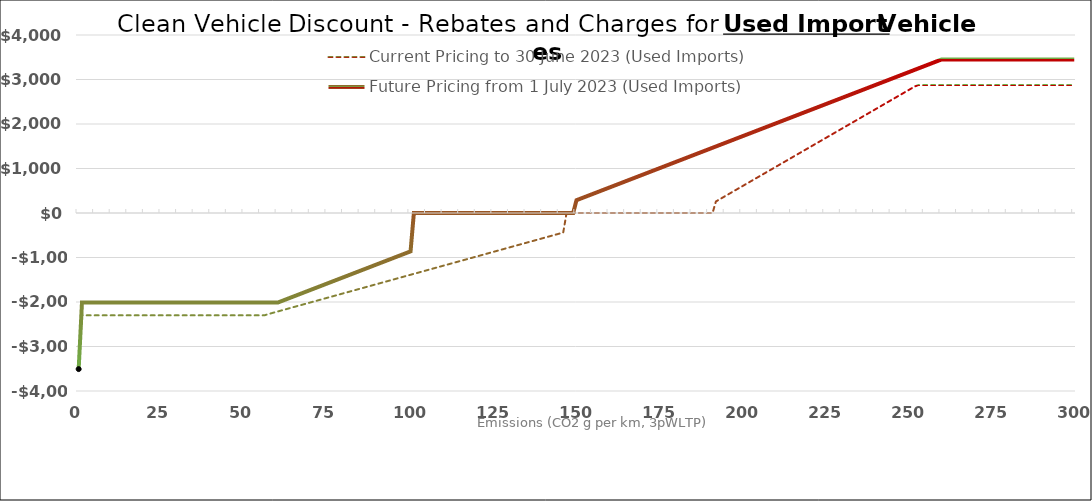
| Category |  Current Pricing to 30 June 2023 (Used Imports)  |  Future Pricing from 1 July 2023 (Used Imports)  |
|---|---|---|
| 0.0 | -3450 | -3507.5 |
| 1.0 | -2300 | -2012.5 |
| 2.0 | -2300 | -2012.5 |
| 3.0 | -2300 | -2012.5 |
| 4.0 | -2300 | -2012.5 |
| 5.0 | -2300 | -2012.5 |
| 6.0 | -2300 | -2012.5 |
| 7.0 | -2300 | -2012.5 |
| 8.0 | -2300 | -2012.5 |
| 9.0 | -2300 | -2012.5 |
| 10.0 | -2300 | -2012.5 |
| 11.0 | -2300 | -2012.5 |
| 12.0 | -2300 | -2012.5 |
| 13.0 | -2300 | -2012.5 |
| 14.0 | -2300 | -2012.5 |
| 15.0 | -2300 | -2012.5 |
| 16.0 | -2300 | -2012.5 |
| 17.0 | -2300 | -2012.5 |
| 18.0 | -2300 | -2012.5 |
| 19.0 | -2300 | -2012.5 |
| 20.0 | -2300 | -2012.5 |
| 21.0 | -2300 | -2012.5 |
| 22.0 | -2300 | -2012.5 |
| 23.0 | -2300 | -2012.5 |
| 24.0 | -2300 | -2012.5 |
| 25.0 | -2300 | -2012.5 |
| 26.0 | -2300 | -2012.5 |
| 27.0 | -2300 | -2012.5 |
| 28.0 | -2300 | -2012.5 |
| 29.0 | -2300 | -2012.5 |
| 30.0 | -2300 | -2012.5 |
| 31.0 | -2300 | -2012.5 |
| 32.0 | -2300 | -2012.5 |
| 33.0 | -2300 | -2012.5 |
| 34.0 | -2300 | -2012.5 |
| 35.0 | -2300 | -2012.5 |
| 36.0 | -2300 | -2012.5 |
| 37.0 | -2300 | -2012.5 |
| 38.0 | -2300 | -2012.5 |
| 39.0 | -2300 | -2012.5 |
| 40.0 | -2300 | -2012.5 |
| 41.0 | -2300 | -2012.5 |
| 42.0 | -2300 | -2012.5 |
| 43.0 | -2300 | -2012.5 |
| 44.0 | -2300 | -2012.5 |
| 45.0 | -2300 | -2012.5 |
| 46.0 | -2300 | -2012.5 |
| 47.0 | -2300 | -2012.5 |
| 48.0 | -2300 | -2012.5 |
| 49.0 | -2300 | -2012.5 |
| 50.0 | -2300 | -2012.5 |
| 51.0 | -2300 | -2012.5 |
| 52.0 | -2300 | -2012.5 |
| 53.0 | -2300 | -2012.5 |
| 54.0 | -2300 | -2012.5 |
| 55.0 | -2300 | -2012.5 |
| 56.0 | -2300 | -2012.5 |
| 57.0 | -2274.621 | -2012.5 |
| 58.0 | -2254 | -2012.5 |
| 59.0 | -2233.379 | -2012.5 |
| 60.0 | -2212.759 | -2012.5 |
| 61.0 | -2192.138 | -1983.75 |
| 62.0 | -2171.517 | -1955 |
| 63.0 | -2150.897 | -1926.25 |
| 64.0 | -2130.276 | -1897.5 |
| 65.0 | -2109.655 | -1868.75 |
| 66.0 | -2089.034 | -1840 |
| 67.0 | -2068.414 | -1811.25 |
| 68.0 | -2047.793 | -1782.5 |
| 69.0 | -2027.172 | -1753.75 |
| 70.0 | -2006.552 | -1725 |
| 71.0 | -1985.931 | -1696.25 |
| 72.0 | -1965.31 | -1667.5 |
| 73.0 | -1944.69 | -1638.75 |
| 74.0 | -1924.069 | -1610 |
| 75.0 | -1903.448 | -1581.25 |
| 76.0 | -1882.828 | -1552.5 |
| 77.0 | -1862.207 | -1523.75 |
| 78.0 | -1841.586 | -1495 |
| 79.0 | -1820.966 | -1466.25 |
| 80.0 | -1800.345 | -1437.5 |
| 81.0 | -1779.724 | -1408.75 |
| 82.0 | -1759.103 | -1380 |
| 83.0 | -1738.483 | -1351.25 |
| 84.0 | -1717.862 | -1322.5 |
| 85.0 | -1697.241 | -1293.75 |
| 86.0 | -1676.621 | -1265 |
| 87.0 | -1656 | -1236.25 |
| 88.0 | -1635.379 | -1207.5 |
| 89.0 | -1614.759 | -1178.75 |
| 90.0 | -1594.138 | -1150 |
| 91.0 | -1573.517 | -1121.25 |
| 92.0 | -1552.897 | -1092.5 |
| 93.0 | -1532.276 | -1063.75 |
| 94.0 | -1511.655 | -1035 |
| 95.0 | -1491.034 | -1006.25 |
| 96.0 | -1470.414 | -977.5 |
| 97.0 | -1449.793 | -948.75 |
| 98.0 | -1429.172 | -920 |
| 99.0 | -1408.552 | -891.25 |
| 100.0 | -1387.931 | -862.5 |
| 101.0 | -1367.31 | 0 |
| 102.0 | -1346.69 | 0 |
| 103.0 | -1326.069 | 0 |
| 104.0 | -1305.448 | 0 |
| 105.0 | -1284.828 | 0 |
| 106.0 | -1264.207 | 0 |
| 107.0 | -1243.586 | 0 |
| 108.0 | -1222.966 | 0 |
| 109.0 | -1202.345 | 0 |
| 110.0 | -1181.724 | 0 |
| 111.0 | -1161.103 | 0 |
| 112.0 | -1140.483 | 0 |
| 113.0 | -1119.862 | 0 |
| 114.0 | -1099.241 | 0 |
| 115.0 | -1078.621 | 0 |
| 116.0 | -1058 | 0 |
| 117.0 | -1037.379 | 0 |
| 118.0 | -1016.759 | 0 |
| 119.0 | -996.138 | 0 |
| 120.0 | -975.517 | 0 |
| 121.0 | -954.897 | 0 |
| 122.0 | -934.276 | 0 |
| 123.0 | -913.655 | 0 |
| 124.0 | -893.034 | 0 |
| 125.0 | -872.414 | 0 |
| 126.0 | -851.793 | 0 |
| 127.0 | -831.172 | 0 |
| 128.0 | -810.552 | 0 |
| 129.0 | -789.931 | 0 |
| 130.0 | -769.31 | 0 |
| 131.0 | -748.69 | 0 |
| 132.0 | -728.069 | 0 |
| 133.0 | -707.448 | 0 |
| 134.0 | -686.828 | 0 |
| 135.0 | -666.207 | 0 |
| 136.0 | -645.586 | 0 |
| 137.0 | -624.966 | 0 |
| 138.0 | -604.345 | 0 |
| 139.0 | -583.724 | 0 |
| 140.0 | -563.103 | 0 |
| 141.0 | -542.483 | 0 |
| 142.0 | -521.862 | 0 |
| 143.0 | -501.241 | 0 |
| 144.0 | -480.621 | 0 |
| 145.0 | -460 | 0 |
| 146.0 | -439.379 | 0 |
| 147.0 | 0 | 0 |
| 148.0 | 0 | 0 |
| 149.0 | 0 | 0 |
| 150.0 | 0 | 287.5 |
| 151.0 | 0 | 316.25 |
| 152.0 | 0 | 345 |
| 153.0 | 0 | 373.75 |
| 154.0 | 0 | 402.5 |
| 155.0 | 0 | 431.25 |
| 156.0 | 0 | 460 |
| 157.0 | 0 | 488.75 |
| 158.0 | 0 | 517.5 |
| 159.0 | 0 | 546.25 |
| 160.0 | 0 | 575 |
| 161.0 | 0 | 603.75 |
| 162.0 | 0 | 632.5 |
| 163.0 | 0 | 661.25 |
| 164.0 | 0 | 690 |
| 165.0 | 0 | 718.75 |
| 166.0 | 0 | 747.5 |
| 167.0 | 0 | 776.25 |
| 168.0 | 0 | 805 |
| 169.0 | 0 | 833.75 |
| 170.0 | 0 | 862.5 |
| 171.0 | 0 | 891.25 |
| 172.0 | 0 | 920 |
| 173.0 | 0 | 948.75 |
| 174.0 | 0 | 977.5 |
| 175.0 | 0 | 1006.25 |
| 176.0 | 0 | 1035 |
| 177.0 | 0 | 1063.75 |
| 178.0 | 0 | 1092.5 |
| 179.0 | 0 | 1121.25 |
| 180.0 | 0 | 1150 |
| 181.0 | 0 | 1178.75 |
| 182.0 | 0 | 1207.5 |
| 183.0 | 0 | 1236.25 |
| 184.0 | 0 | 1265 |
| 185.0 | 0 | 1293.75 |
| 186.0 | 0 | 1322.5 |
| 187.0 | 0 | 1351.25 |
| 188.0 | 0 | 1380 |
| 189.0 | 0 | 1408.75 |
| 190.0 | 0 | 1437.5 |
| 191.0 | 0 | 1466.25 |
| 192.0 | 258.75 | 1495 |
| 193.0 | 301.875 | 1523.75 |
| 194.0 | 345 | 1552.5 |
| 195.0 | 388.125 | 1581.25 |
| 196.0 | 431.25 | 1610 |
| 197.0 | 474.375 | 1638.75 |
| 198.0 | 517.5 | 1667.5 |
| 199.0 | 560.625 | 1696.25 |
| 200.0 | 603.75 | 1725 |
| 201.0 | 646.875 | 1753.75 |
| 202.0 | 690 | 1782.5 |
| 203.0 | 733.125 | 1811.25 |
| 204.0 | 776.25 | 1840 |
| 205.0 | 819.375 | 1868.75 |
| 206.0 | 862.5 | 1897.5 |
| 207.0 | 905.625 | 1926.25 |
| 208.0 | 948.75 | 1955 |
| 209.0 | 991.875 | 1983.75 |
| 210.0 | 1035 | 2012.5 |
| 211.0 | 1078.125 | 2041.25 |
| 212.0 | 1121.25 | 2070 |
| 213.0 | 1164.375 | 2098.75 |
| 214.0 | 1207.5 | 2127.5 |
| 215.0 | 1250.625 | 2156.25 |
| 216.0 | 1293.75 | 2185 |
| 217.0 | 1336.875 | 2213.75 |
| 218.0 | 1380 | 2242.5 |
| 219.0 | 1423.125 | 2271.25 |
| 220.0 | 1466.25 | 2300 |
| 221.0 | 1509.375 | 2328.75 |
| 222.0 | 1552.5 | 2357.5 |
| 223.0 | 1595.625 | 2386.25 |
| 224.0 | 1638.75 | 2415 |
| 225.0 | 1681.875 | 2443.75 |
| 226.0 | 1725 | 2472.5 |
| 227.0 | 1768.125 | 2501.25 |
| 228.0 | 1811.25 | 2530 |
| 229.0 | 1854.375 | 2558.75 |
| 230.0 | 1897.5 | 2587.5 |
| 231.0 | 1940.625 | 2616.25 |
| 232.0 | 1983.75 | 2645 |
| 233.0 | 2026.875 | 2673.75 |
| 234.0 | 2070 | 2702.5 |
| 235.0 | 2113.125 | 2731.25 |
| 236.0 | 2156.25 | 2760 |
| 237.0 | 2199.375 | 2788.75 |
| 238.0 | 2242.5 | 2817.5 |
| 239.0 | 2285.625 | 2846.25 |
| 240.0 | 2328.75 | 2875 |
| 241.0 | 2371.875 | 2903.75 |
| 242.0 | 2415 | 2932.5 |
| 243.0 | 2458.125 | 2961.25 |
| 244.0 | 2501.25 | 2990 |
| 245.0 | 2544.375 | 3018.75 |
| 246.0 | 2587.5 | 3047.5 |
| 247.0 | 2630.625 | 3076.25 |
| 248.0 | 2673.75 | 3105 |
| 249.0 | 2716.875 | 3133.75 |
| 250.0 | 2760 | 3162.5 |
| 251.0 | 2803.125 | 3191.25 |
| 252.0 | 2846.25 | 3220 |
| 253.0 | 2875 | 3248.75 |
| 254.0 | 2875 | 3277.5 |
| 255.0 | 2875 | 3306.25 |
| 256.0 | 2875 | 3335 |
| 257.0 | 2875 | 3363.75 |
| 258.0 | 2875 | 3392.5 |
| 259.0 | 2875 | 3421.25 |
| 260.0 | 2875 | 3450 |
| 261.0 | 2875 | 3450 |
| 262.0 | 2875 | 3450 |
| 263.0 | 2875 | 3450 |
| 264.0 | 2875 | 3450 |
| 265.0 | 2875 | 3450 |
| 266.0 | 2875 | 3450 |
| 267.0 | 2875 | 3450 |
| 268.0 | 2875 | 3450 |
| 269.0 | 2875 | 3450 |
| 270.0 | 2875 | 3450 |
| 271.0 | 2875 | 3450 |
| 272.0 | 2875 | 3450 |
| 273.0 | 2875 | 3450 |
| 274.0 | 2875 | 3450 |
| 275.0 | 2875 | 3450 |
| 276.0 | 2875 | 3450 |
| 277.0 | 2875 | 3450 |
| 278.0 | 2875 | 3450 |
| 279.0 | 2875 | 3450 |
| 280.0 | 2875 | 3450 |
| 281.0 | 2875 | 3450 |
| 282.0 | 2875 | 3450 |
| 283.0 | 2875 | 3450 |
| 284.0 | 2875 | 3450 |
| 285.0 | 2875 | 3450 |
| 286.0 | 2875 | 3450 |
| 287.0 | 2875 | 3450 |
| 288.0 | 2875 | 3450 |
| 289.0 | 2875 | 3450 |
| 290.0 | 2875 | 3450 |
| 291.0 | 2875 | 3450 |
| 292.0 | 2875 | 3450 |
| 293.0 | 2875 | 3450 |
| 294.0 | 2875 | 3450 |
| 295.0 | 2875 | 3450 |
| 296.0 | 2875 | 3450 |
| 297.0 | 2875 | 3450 |
| 298.0 | 2875 | 3450 |
| 299.0 | 2875 | 3450 |
| 300.0 | 2875 | 3450 |